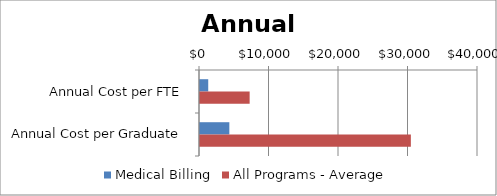
| Category | Medical Billing | All Programs - Average |
|---|---|---|
| Annual Cost per FTE | 1184.065 | 7144 |
| Annual Cost per Graduate | 4223.167 | 30340 |